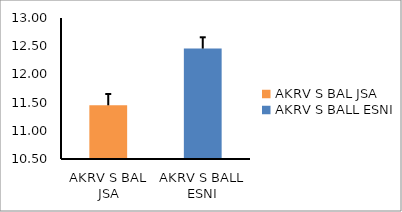
| Category | Series 0 |
|---|---|
| AKRV S BAL JSA | 11.452 |
| AKRV S BALL ESNI | 12.458 |